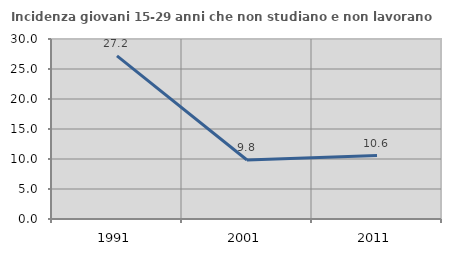
| Category | Incidenza giovani 15-29 anni che non studiano e non lavorano  |
|---|---|
| 1991.0 | 27.184 |
| 2001.0 | 9.834 |
| 2011.0 | 10.583 |